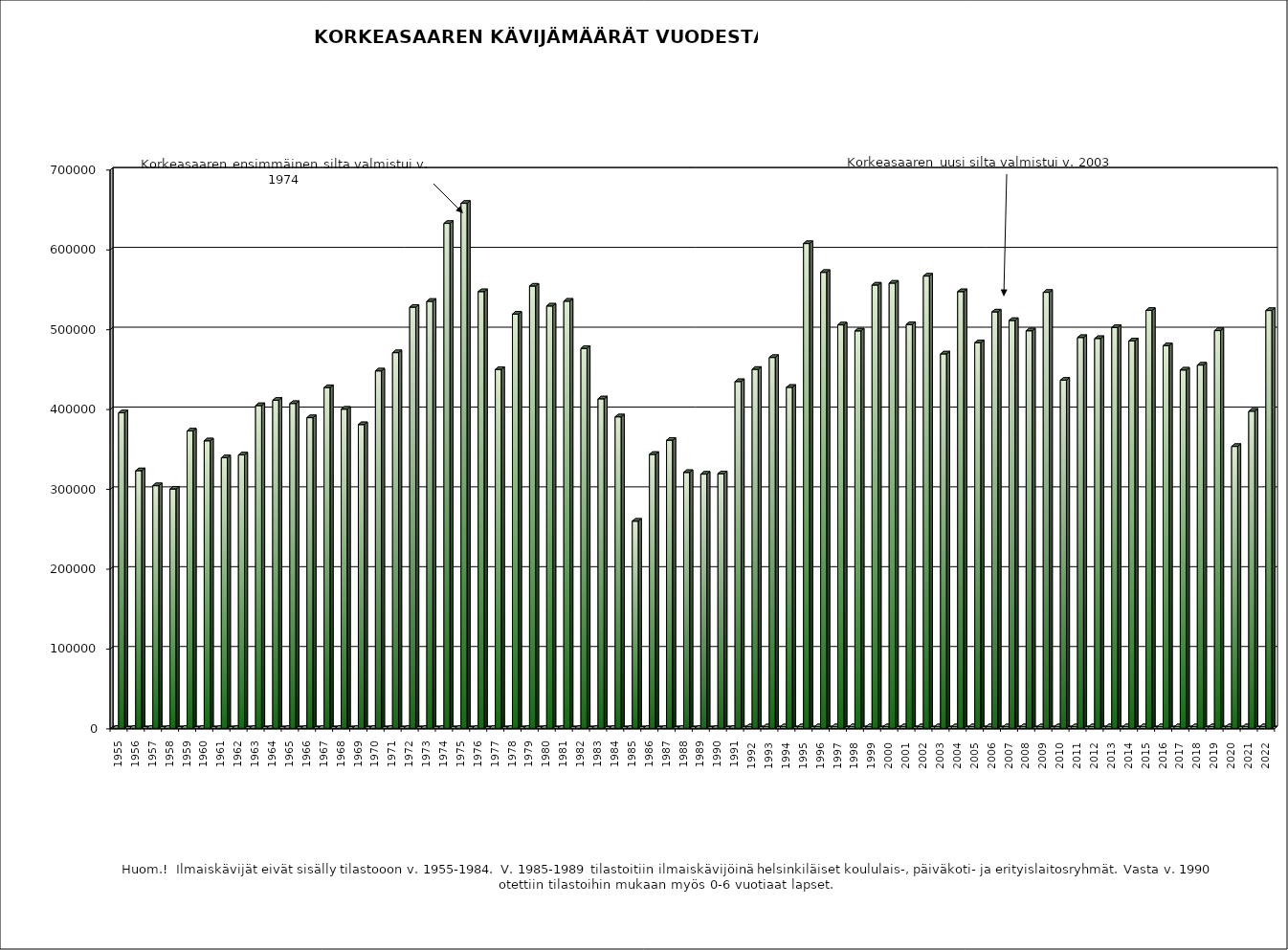
| Category | Series 0 | Series 1 |
|---|---|---|
| 1955 | 0 | 395253 |
| 1956 | 0 | 322776 |
| 1957 | 0 | 304010 |
| 1958 | 0 | 299789 |
| 1959 | 0 | 372506 |
| 1960 | 0 | 360184 |
| 1961 | 0 | 338949 |
| 1962 | 0 | 342502 |
| 1963 | 0 | 404355 |
| 1964 | 0 | 410950 |
| 1965 | 0 | 406973 |
| 1966 | 0 | 389175 |
| 1967 | 0 | 426926 |
| 1968 | 0 | 399817 |
| 1969 | 0 | 380536 |
| 1970 | 0 | 447762 |
| 1971 | 0 | 470626 |
| 1972 | 0 | 527550 |
| 1973 | 0 | 534943 |
| 1974 | 0 | 632553 |
| 1975 | 0 | 657694 |
| 1976 | 0 | 547081 |
| 1977 | 0 | 449628 |
| 1978 | 0 | 518923 |
| 1979 | 0 | 554018 |
| 1980 | 0 | 529074 |
| 1981 | 0 | 535088 |
| 1982 | 0 | 475875 |
| 1983 | 0 | 412793 |
| 1984 | 0 | 390224 |
| 1985 | 0 | 259549 |
| 1986 | 0 | 343216 |
| 1987 | 0 | 360872 |
| 1988 | 0 | 320575 |
| 1989 | 0 | 318485 |
| 1990 | 0 | 318946 |
| 1991 | 0 | 434415 |
| 1992  | 1992 | 449748 |
| 1993  | 1993 | 464610 |
| 1994  | 1994 | 427188 |
| 1995  | 1995 | 607329 |
| 1996  | 1996 | 571200 |
| 1997  | 1997 | 505405 |
| 1998  | 1998 | 497863 |
| 1999  | 1999 | 555318 |
| 2000  | 2000 | 557697 |
| 2001  | 2001 | 505800 |
| 2002  | 2002 | 566574 |
| 2003  | 2003 | 469059 |
| 2004  | 2004 | 547087 |
| 2005  | 2005 | 483202 |
| 2006  | 2006 | 521671 |
| 2007  | 2007 | 510963 |
| 2008  | 2008 | 498031 |
| 2009  | 2009 | 546201 |
| 2010  | 2010 | 436135 |
| 2011  | 2011 | 489621 |
| 2012  | 2012 | 488369 |
| 2013  | 2013 | 502162 |
| 2014  | 2014 | 485400 |
| 2015  | 2015 | 523602 |
| 2016  | 2016 | 479394 |
| 2017  | 2017 | 448882 |
| 2018  | 2018 | 455083 |
| 2019  | 2019 | 498266 |
| 2020  | 2020 | 353194 |
| 2021  | 2021 | 397286 |
| 2022  | 2022 | 523427 |